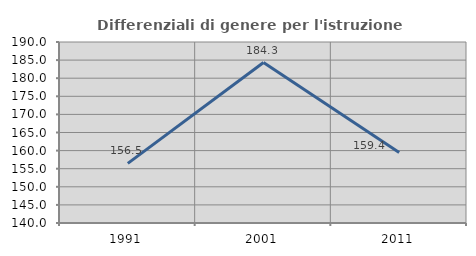
| Category | Differenziali di genere per l'istruzione superiore |
|---|---|
| 1991.0 | 156.466 |
| 2001.0 | 184.316 |
| 2011.0 | 159.444 |